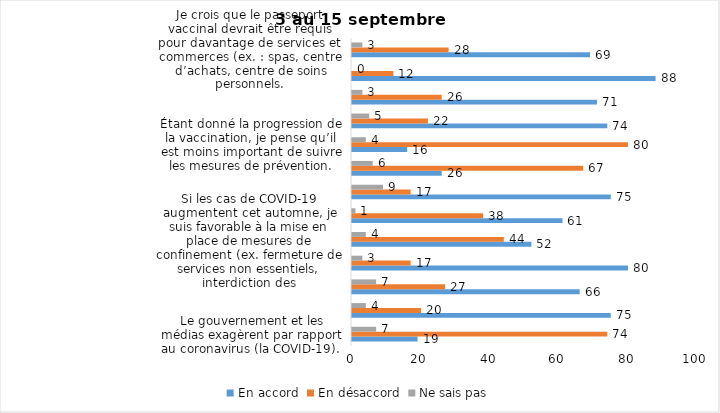
| Category | En accord | En désaccord | Ne sais pas |
|---|---|---|---|
| Le gouvernement et les médias exagèrent par rapport au coronavirus (la COVID-19). | 19 | 74 | 7 |
| J’ai peur que le système de santé soit débordé par les cas de COVID-19 suite au "déconfinement" | 75 | 20 | 4 |
| J’ai peur que la reprise des cours en présentiel dans les cégeps et les universités génère une augmentation des cas de COVID-19. | 66 | 27 | 7 |
| Je suis favorable au passeport vaccinal qui permettrait l'accès à certains lieux ou activités aux personnes vaccinées. | 80 | 17 | 3 |
| Si les cas de COVID-19 augmentent cet automne, je suis favorable à la mise en place de mesures de confinement (ex. fermeture de services non essentiels, interdiction des rassemblements privés) | 52 | 44 | 4 |
| Je suis inquiet de contracter le variant Delta de la Covid-19 | 61 | 38 | 1 |
| Je suis confiant que la vaccination protège efficacement contre les variants de la COVID-19 | 75 | 17 | 9 |
| Je suis favorable à ce que le port du masque ne soit plus obligatoire au Québec. | 26 | 67 | 6 |
| Étant donné la progression de la vaccination, je pense qu’il est moins important de suivre les mesures de prévention. | 16 | 80 | 4 |
| J'ai peur que la reprise des cours en présentiel dans les écoles primaires et secondaires génère une augmentation des cas de COVID-19 | 74 | 22 | 5 |
| Je suis favorable à ce qu’il y ait des sanctions aux commerçants qui ne vérifieront pas le passeport vaccinal (code QR) de leurs clients | 71 | 26 | 3 |
| Je suis favorable à ce qu’il y ait des sanctions aux gens qui tenteront de frauder leur passeport vaccinal par des amendes ou des accusations criminelles. | 88 | 12 | 0 |
| Je crois que le passeport vaccinal devrait être requis pour davantage de services et commerces (ex. : spas, centre d’achats, centre de soins personnels. | 69 | 28 | 3 |